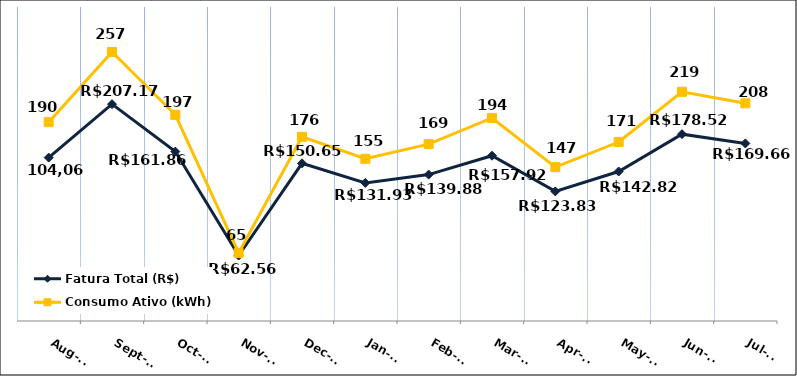
| Category | Fatura Total (R$) | Consumo Ativo (kWh) |
|---|---|---|
| 2023-08-01 | 156.12 | 190 |
| 2023-09-01 | 207.17 | 257 |
| 2023-10-01 | 161.86 | 197 |
| 2023-11-01 | 62.56 | 65 |
| 2023-12-01 | 150.65 | 176 |
| 2024-01-01 | 131.93 | 155 |
| 2024-02-01 | 139.88 | 169 |
| 2024-03-01 | 157.92 | 194 |
| 2024-04-01 | 123.83 | 147 |
| 2024-05-01 | 142.82 | 171 |
| 2024-06-01 | 178.52 | 219 |
| 2024-07-01 | 169.66 | 208 |